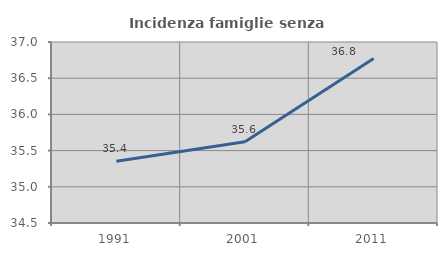
| Category | Incidenza famiglie senza nuclei |
|---|---|
| 1991.0 | 35.354 |
| 2001.0 | 35.622 |
| 2011.0 | 36.771 |